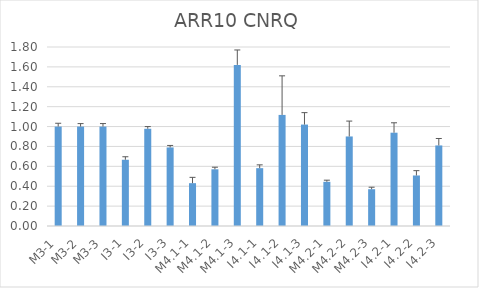
| Category | ARR10 CNRQ |
|---|---|
| M3-1 | 1 |
| M3-2 | 1 |
| M3-3 | 1 |
| I3-1 | 0.666 |
| I3-2 | 0.978 |
| I3-3 | 0.79 |
| M4.1-1 | 0.431 |
| M4.1-2 | 0.57 |
| M4.1-3 | 1.62 |
| I4.1-1 | 0.582 |
| I4.1-2 | 1.117 |
| I4.1-3 | 1.02 |
| M4.2-1 | 0.444 |
| M4.2-2 | 0.9 |
| M4.2-3 | 0.37 |
| I4.2-1 | 0.938 |
| I4.2-2 | 0.508 |
| I4.2-3 | 0.81 |